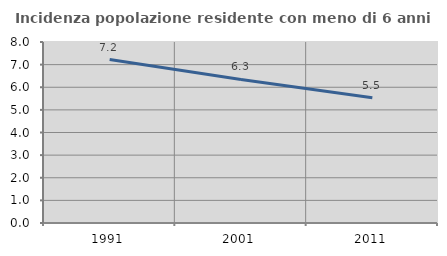
| Category | Incidenza popolazione residente con meno di 6 anni |
|---|---|
| 1991.0 | 7.225 |
| 2001.0 | 6.344 |
| 2011.0 | 5.538 |